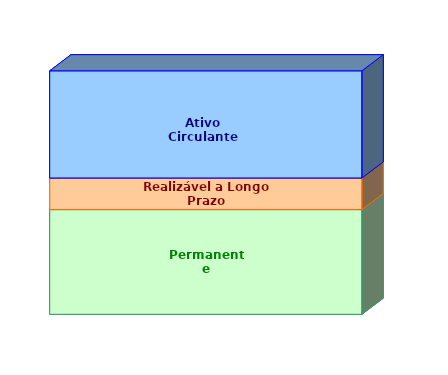
| Category | Permanente | Realizável a Longo Prazo | Ativo Circulante |
|---|---|---|---|
| 0 | 0.43 | 0.13 | 0.44 |